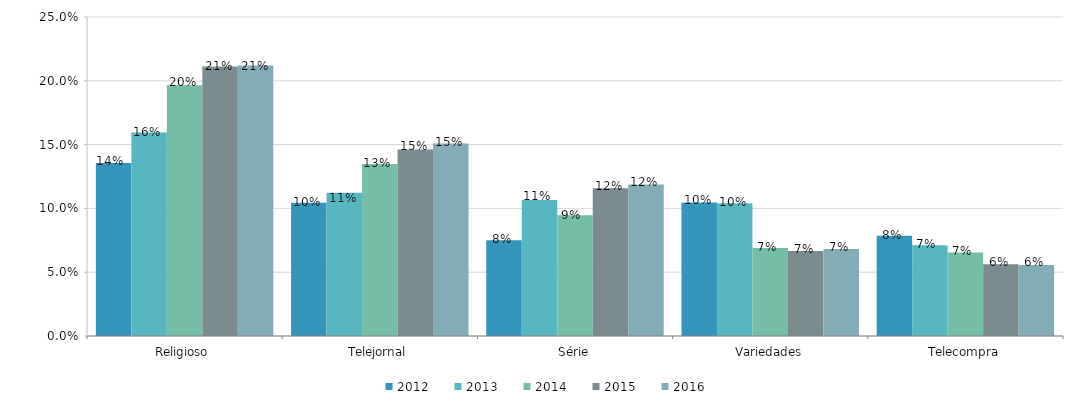
| Category | 2012 | 2013 | 2014 | 2015 | 2016 |
|---|---|---|---|---|---|
| Religioso | 0.136 | 0.16 | 0.197 | 0.211 | 0.212 |
| Telejornal | 0.104 | 0.112 | 0.135 | 0.146 | 0.151 |
| Série | 0.075 | 0.107 | 0.095 | 0.116 | 0.119 |
| Variedades | 0.105 | 0.104 | 0.069 | 0.067 | 0.068 |
| Telecompra | 0.078 | 0.071 | 0.065 | 0.056 | 0.056 |